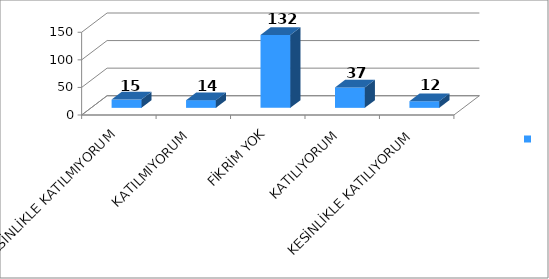
| Category | Series 0 |
|---|---|
| KESİNLİKLE KATILMIYORUM | 15 |
| KATILMIYORUM | 14 |
| FİKRİM YOK | 132 |
| KATILIYORUM | 37 |
| KESİNLİKLE KATILIYORUM | 12 |